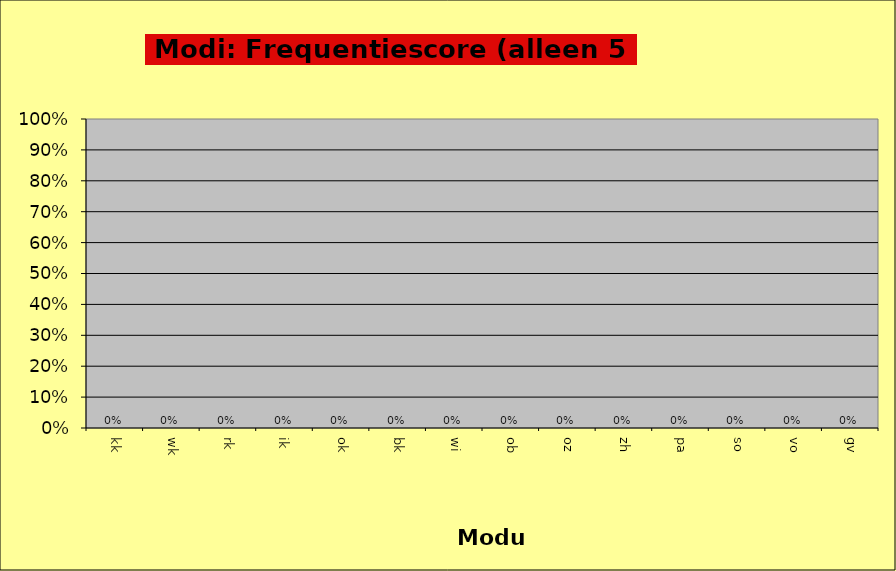
| Category | Series 0 |
|---|---|
| kk | 0 |
| wk | 0 |
| rk | 0 |
| ik | 0 |
| ok | 0 |
| bk | 0 |
| wi | 0 |
| ob | 0 |
| oz | 0 |
| zh | 0 |
| pa | 0 |
| so | 0 |
| vo | 0 |
| gv | 0 |